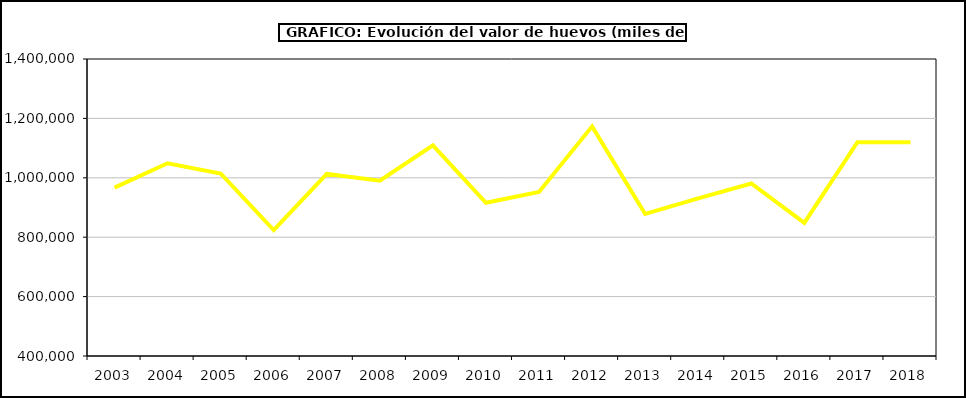
| Category | huevos |
|---|---|
| 2003.0 | 966991.3 |
| 2004.0 | 1049094.98 |
| 2005.0 | 1014518.979 |
| 2006.0 | 823874.691 |
| 2007.0 | 1012879.578 |
| 2008.0 | 990180.415 |
| 2009.0 | 1109356.704 |
| 2010.0 | 915832.84 |
| 2011.0 | 952462.311 |
| 2012.0 | 1173176.818 |
| 2013.0 | 878243.026 |
| 2014.0 | 930912.202 |
| 2015.0 | 980944.68 |
| 2016.0 | 848224 |
| 2017.0 | 1119773.503 |
| 2018.0 | 1119711.329 |